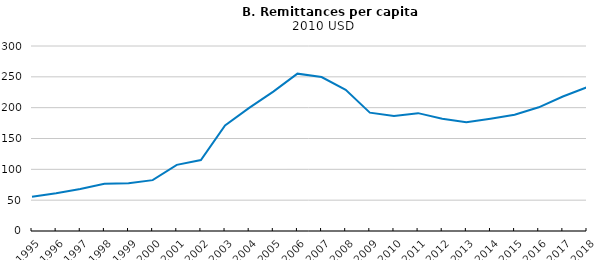
| Category | Series 1 |
|---|---|
| 1995.0 | 55.625 |
| 1996.0 | 61.246 |
| 1997.0 | 67.99 |
| 1998.0 | 76.435 |
| 1999.0 | 77.591 |
| 2000.0 | 82.503 |
| 2001.0 | 107.293 |
| 2002.0 | 115.061 |
| 2003.0 | 171.336 |
| 2004.0 | 199.735 |
| 2005.0 | 226.052 |
| 2006.0 | 255.164 |
| 2007.0 | 249.643 |
| 2008.0 | 228.885 |
| 2009.0 | 191.888 |
| 2010.0 | 186.458 |
| 2011.0 | 191.116 |
| 2012.0 | 182.082 |
| 2013.0 | 176.347 |
| 2014.0 | 181.986 |
| 2015.0 | 188.474 |
| 2016.0 | 200.59 |
| 2017.0 | 218.158 |
| 2018.0 | 233.099 |